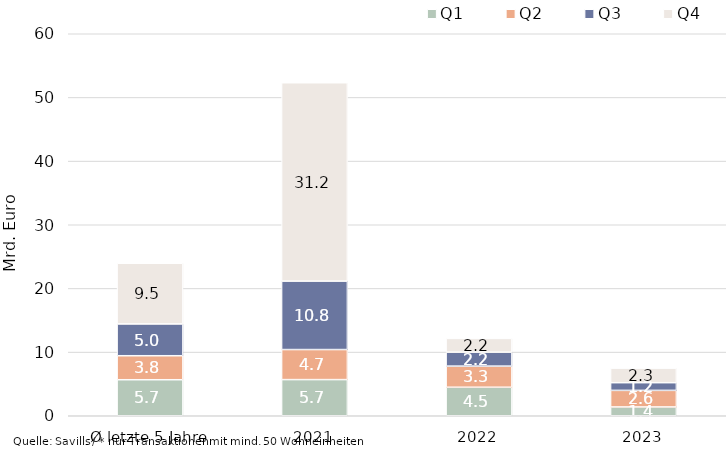
| Category | Q1 | Q2 | Q3 | Q4 |
|---|---|---|---|---|
| Ø letzte 5 Jahre | 5658965765.166 | 3769832451.908 | 4997300272.744 | 9526306588.076 |
| 2021 | 5676886758 | 4721007645 | 10751893445.75 | 31156264639.5 |
| 2022 | 4477957320.54 | 3321253136 | 2192659976.13 | 2158741060 |
| 2023 | 1382171561.98 | 2605240695.42 | 1206888604.76 | 2284345991.85 |